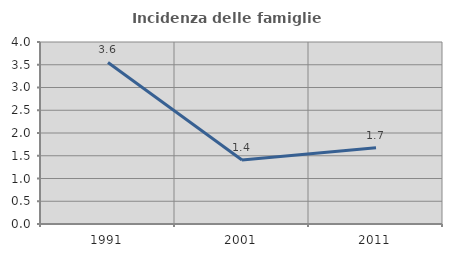
| Category | Incidenza delle famiglie numerose |
|---|---|
| 1991.0 | 3.55 |
| 2001.0 | 1.408 |
| 2011.0 | 1.678 |